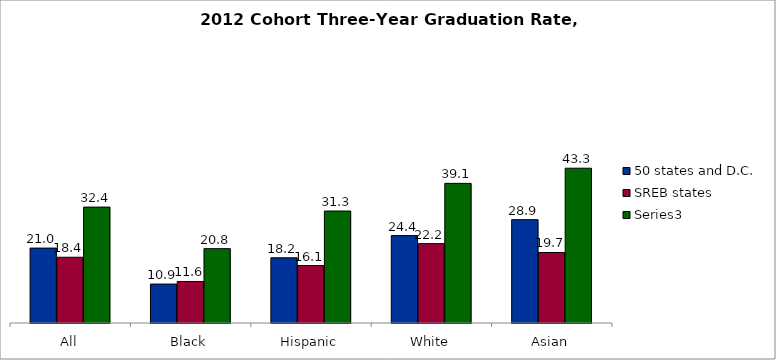
| Category | 50 states and D.C. | SREB states | Series 2 |
|---|---|---|---|
| All | 20.954 | 18.395 | 32.418 |
| Black | 10.885 | 11.613 | 20.799 |
| Hispanic | 18.237 | 16.075 | 31.321 |
| White | 24.446 | 22.202 | 39.059 |
| Asian | 28.904 | 19.723 | 43.299 |